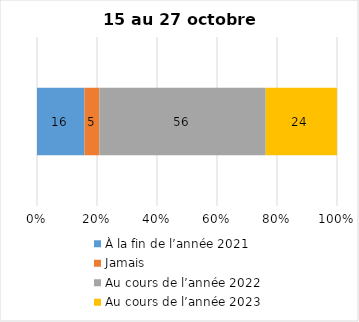
| Category | À la fin de l’année 2021 | Jamais | Au cours de l’année 2022 | Au cours de l’année 2023 |
|---|---|---|---|---|
| 0 | 16 | 5 | 56 | 24 |